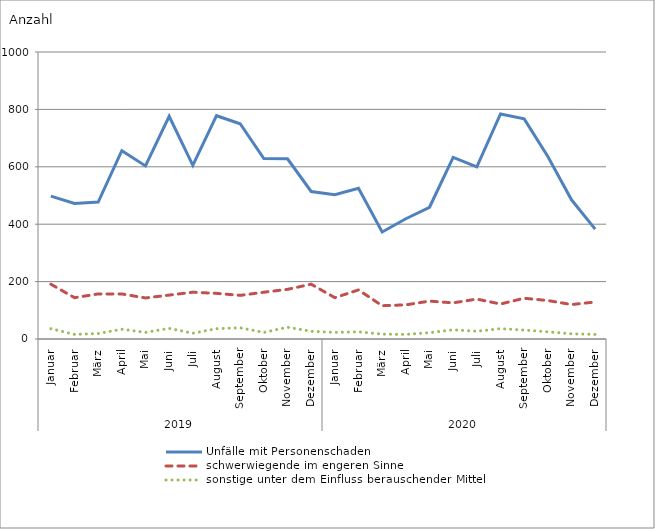
| Category | Unfälle mit Personenschaden | schwerwiegende im engeren Sinne | sonstige unter dem Einfluss berauschender Mittel |
|---|---|---|---|
| 0 | 498 | 191 | 36 |
| 1 | 472 | 144 | 16 |
| 2 | 477 | 157 | 19 |
| 3 | 656 | 157 | 34 |
| 4 | 603 | 143 | 23 |
| 5 | 776 | 153 | 37 |
| 6 | 605 | 163 | 20 |
| 7 | 778 | 159 | 36 |
| 8 | 750 | 152 | 39 |
| 9 | 629 | 163 | 23 |
| 10 | 628 | 173 | 41 |
| 11 | 514 | 191 | 27 |
| 12 | 503 | 144 | 23 |
| 13 | 525 | 171 | 25 |
| 14 | 373 | 116 | 17 |
| 15 | 419 | 119 | 16 |
| 16 | 459 | 132 | 22 |
| 17 | 633 | 126 | 32 |
| 18 | 600 | 139 | 27 |
| 19 | 784 | 122 | 36 |
| 20 | 767 | 142 | 31 |
| 21 | 636 | 134 | 25 |
| 22 | 485 | 120 | 18 |
| 23 | 383 | 129 | 16 |